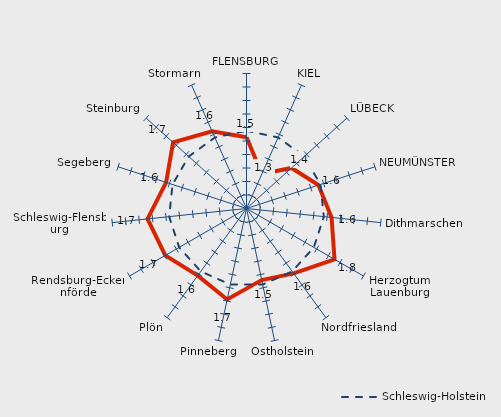
| Category | Kreise | Schleswig-Holstein |
|---|---|---|
| FLENSBURG | 1.527 | 1.576 |
| KIEL | 1.279 | 1.576 |
| LÜBECK | 1.449 | 1.576 |
| NEUMÜNSTER | 1.561 | 1.576 |
| Dithmarschen | 1.633 | 1.576 |
| Herzogtum Lauenburg | 1.753 | 1.576 |
| Nordfriesland | 1.594 | 1.576 |
| Ostholstein | 1.542 | 1.576 |
| Pinneberg | 1.689 | 1.576 |
| Plön | 1.614 | 1.576 |
| Rendsburg-Eckernförde | 1.695 | 1.576 |
| Schleswig-Flensburg | 1.737 | 1.576 |
| Segeberg | 1.626 | 1.576 |
| Steinburg | 1.732 | 1.576 |
| Stormarn | 1.625 | 1.576 |